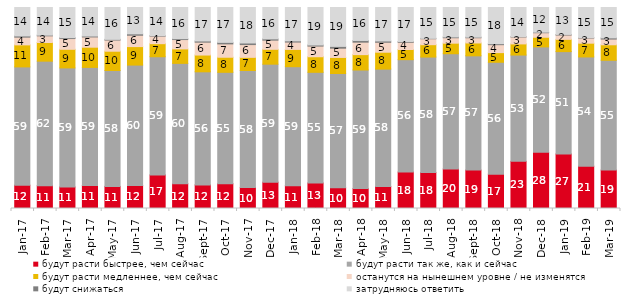
| Category | будут расти быстрее, чем сейчас | будут расти так же, как и сейчас | будут расти медленнее, чем сейчас | останутся на нынешнем уровне / не изменятся | будут снижаться | затрудняюсь ответить |
|---|---|---|---|---|---|---|
| 2017-01-01 | 11.6 | 58.85 | 10.95 | 3.85 | 0.6 | 14.15 |
| 2017-02-01 | 11.35 | 61.95 | 9.3 | 3.3 | 0.35 | 13.75 |
| 2017-03-01 | 10.7 | 59.25 | 9.25 | 5.35 | 0.45 | 15 |
| 2017-04-01 | 11.45 | 58.75 | 10.05 | 5.1 | 0.45 | 14.2 |
| 2017-05-01 | 11 | 57.65 | 9.6 | 5.55 | 0.35 | 15.85 |
| 2017-06-01 | 11.5 | 59.85 | 9.2 | 5.65 | 0.7 | 13.1 |
| 2017-07-01 | 16.7 | 58.8 | 6.5 | 3.75 | 0.25 | 14 |
| 2017-08-01 | 12.35 | 59.85 | 7.2 | 4.65 | 0.45 | 15.5 |
| 2017-09-01 | 11.75 | 56.25 | 8.35 | 6.4 | 0.6 | 16.65 |
| 2017-10-01 | 12.3 | 55.45 | 7.5 | 6.65 | 0.75 | 17.35 |
| 2017-11-01 | 10.4 | 58.25 | 6.55 | 6.35 | 0.8 | 17.65 |
| 2017-12-01 | 13.1 | 58.7 | 7.4 | 4.55 | 0.65 | 15.6 |
| 2018-01-01 | 11.35 | 59.2 | 8.6 | 3.65 | 0.6 | 16.6 |
| 2018-02-01 | 12.7 | 55.05 | 7.75 | 5.3 | 0.55 | 18.65 |
| 2018-03-01 | 10.3 | 56.85 | 8 | 4.6 | 0.9 | 19.35 |
| 2018-04-01 | 9.9 | 59 | 7.65 | 6.2 | 0.85 | 16.4 |
| 2018-05-01 | 10.95 | 58.4 | 8.4 | 4.95 | 0.65 | 16.65 |
| 2018-06-01 | 18.15 | 55.9 | 5.05 | 3.6 | 0.4 | 16.9 |
| 2018-07-01 | 17.85 | 57.5 | 6.15 | 2.95 | 0.2 | 15.35 |
| 2018-08-01 | 19.65 | 57.35 | 5.25 | 2.7 | 0.4 | 14.65 |
| 2018-09-01 | 19.1 | 56.85 | 6.4 | 2.6 | 0.3 | 14.75 |
| 2018-10-01 | 17.1 | 55.65 | 4.8 | 3.95 | 0.5 | 18 |
| 2018-11-01 | 23.453 | 52.894 | 5.539 | 3.443 | 0.2 | 14.471 |
| 2018-12-01 | 27.95 | 52.45 | 4.8 | 2.25 | 0.3 | 12.25 |
| 2019-01-01 | 27.15 | 50.9 | 6.1 | 2.15 | 0.3 | 13.4 |
| 2019-02-01 | 21.05 | 54.35 | 6.85 | 2.55 | 0.2 | 15 |
| 2019-03-01 | 19.095 | 54.649 | 7.708 | 2.834 | 0.597 | 15.117 |